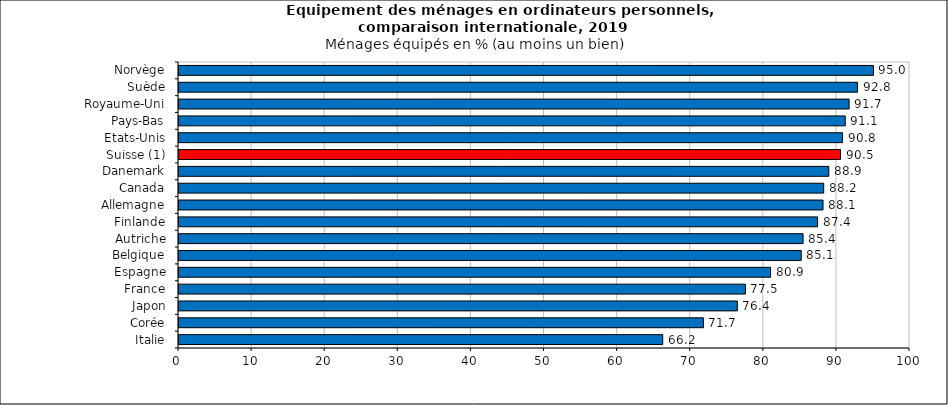
| Category | Italie |
|---|---|
| Italie | 66.176 |
| Corée | 71.744 |
| Japon | 76.379 |
| France | 77.483 |
| Espagne | 80.926 |
| Belgique | 85.119 |
| Autriche | 85.373 |
| Finlande | 87.355 |
| Allemagne | 88.102 |
| Canada | 88.194 |
| Danemark | 88.891 |
| Suisse (1) | 90.496 |
| Etats-Unis | 90.77 |
| Pays-Bas | 91.139 |
| Royaume-Uni | 91.67 |
| Suède | 92.82 |
| Norvège | 95 |